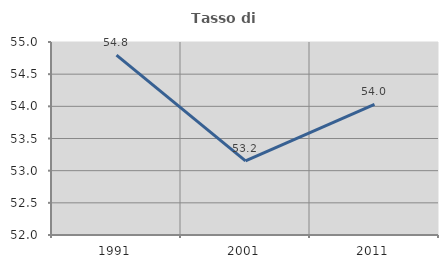
| Category | Tasso di occupazione   |
|---|---|
| 1991.0 | 54.797 |
| 2001.0 | 53.152 |
| 2011.0 | 54.03 |